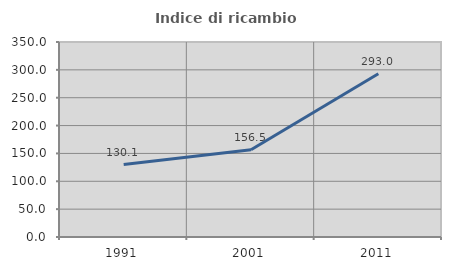
| Category | Indice di ricambio occupazionale  |
|---|---|
| 1991.0 | 130.124 |
| 2001.0 | 156.494 |
| 2011.0 | 293.023 |